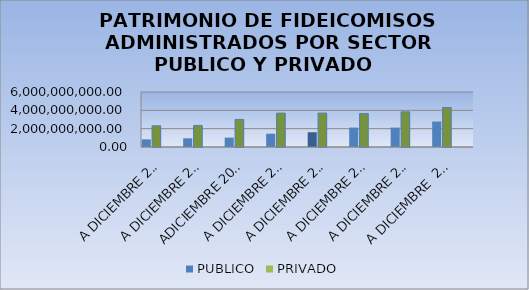
| Category | PUBLICO | Series 1 | PRIVADO | Series 3 |
|---|---|---|---|---|
| A DICIEMBRE 2004 | 832429950.85 | 2312180377.6 |  |  |
| A DICIEMBRE 2005 | 950503273.99 | 2355223745.21 |  |  |
| ADICIEMBRE 2006 | 1026985217.85 | 3010090437.88 |  |  |
| A DICIEMBRE 2007 | 1448128359.02 | 3700512187.15 |  |  |
| A DICIEMBRE 2008 | 1611663156.88 | 3700616047.8 |  |  |
| A DICIEMBRE 2009 | 2119020885.59 | 3654760299.49 |  |  |
| A DICIEMBRE 2010 | 2118732095.86 | 3838079782.28 |  |  |
| A DICIEMBRE  2011 | 2781737120.15 | 4314826966.78 |  |  |